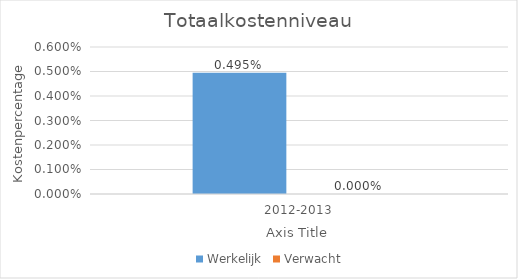
| Category | Werkelijk | Verwacht |
|---|---|---|
| 2012-2013 | 0.005 | 0 |